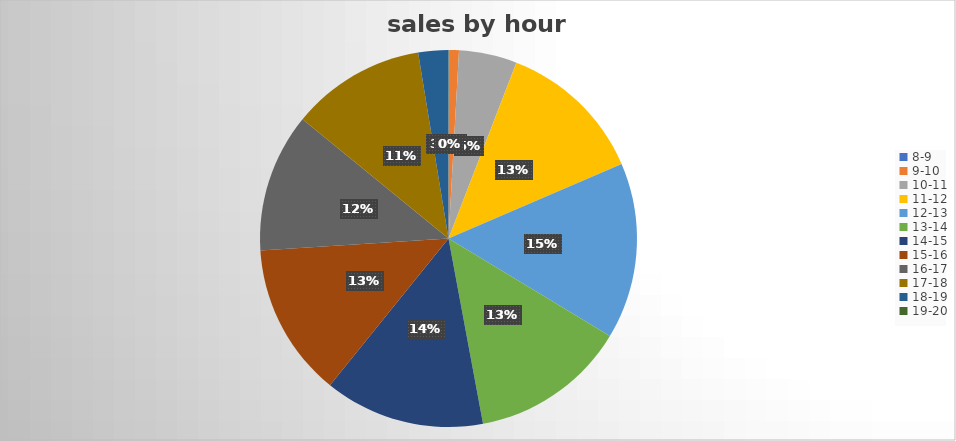
| Category | Series 0 |
|---|---|
| 8-9 | 1.361 |
| 9-10 | 22.621 |
| 10-11 | 133.883 |
| 11-12 | 340.815 |
| 12-13 | 407.055 |
| 13-14 | 361.466 |
| 14-15 | 370.105 |
| 15-16 | 354.423 |
| 16-17 | 321.011 |
| 17-18 | 310.1 |
| 18-19 | 68.653 |
| 19-20 | 0.8 |